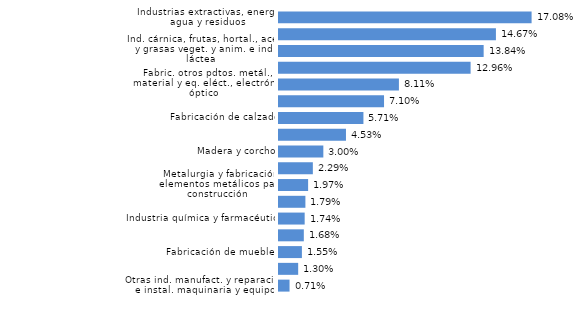
| Category | La Rioja |
|---|---|
| Otras ind. manufact. y reparación e instal. maquinaria y equipo | 0.007 |
| Forja y talleres | 0.013 |
| Fabricación de muebles | 0.015 |
| Ind. textil, confección, cuero, marroquinería y viaje | 0.017 |
| Industria química y farmacéutica | 0.017 |
| Papel, artes gráficas y reproducción soportes grabados | 0.018 |
| Metalurgia y fabricación elementos metálicos para construcción | 0.02 |
| Productos minerales no metálicos diversos | 0.023 |
| Madera y corcho | 0.03 |
| Fabricación de maquinaria, equipo y material de transporte | 0.045 |
| Fabricación de calzado | 0.057 |
| Caucho y materias plásticas | 0.071 |
| Fabric. otros pdtos. metál., material y eq. eléct., electrón. y óptico | 0.081 |
| Otras ind. alimenticias, bebidas (exto. elaborac. vinos) y tabaco | 0.13 |
| Ind. cárnica, frutas, hortal., aceit. y grasas veget. y anim. e ind. láctea | 0.138 |
| Elaboración de vinos | 0.147 |
| Industrias extractivas, energía, agua y residuos | 0.171 |